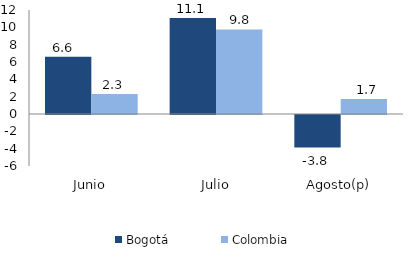
| Category | Bogotá | Colombia |
|---|---|---|
| Junio | 6.617 | 2.315 |
| Julio | 11.091 | 9.754 |
| Agosto(p) | -3.756 | 1.734 |